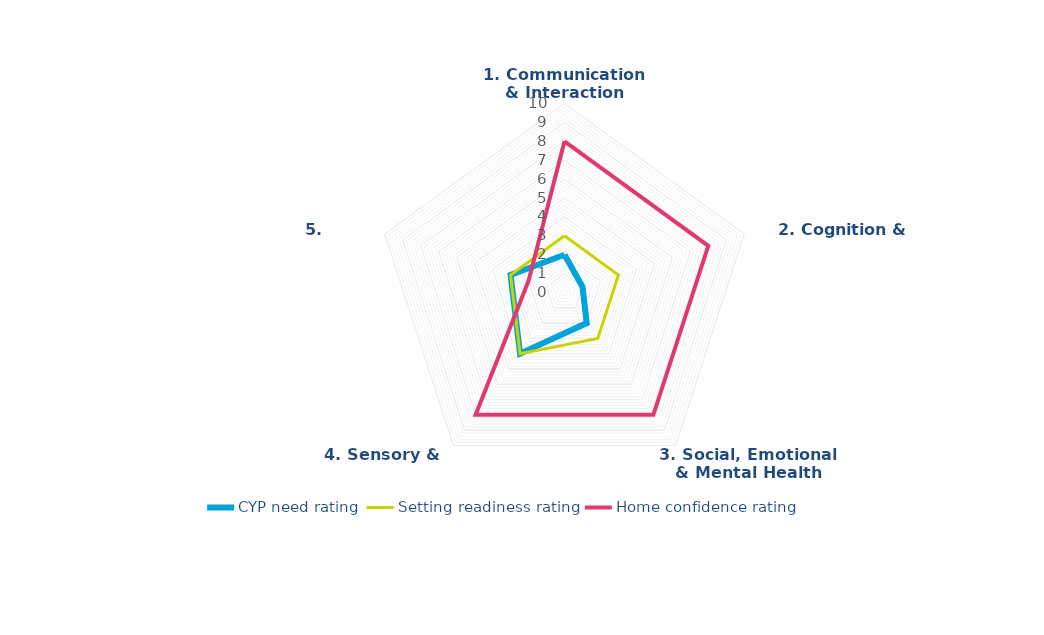
| Category | CYP need rating | Setting readiness rating | Home confidence rating |
|---|---|---|---|
| 1. Communication & Interaction | 2 | 3 | 8 |
| 2. Cognition & Learning | 1 | 3 | 8 |
| 3. Social, Emotional & Mental Health | 2 | 3 | 8 |
| 4. Sensory & Physical | 4 | 4 | 8 |
| 5. Independence | 3 | 3 | 2 |